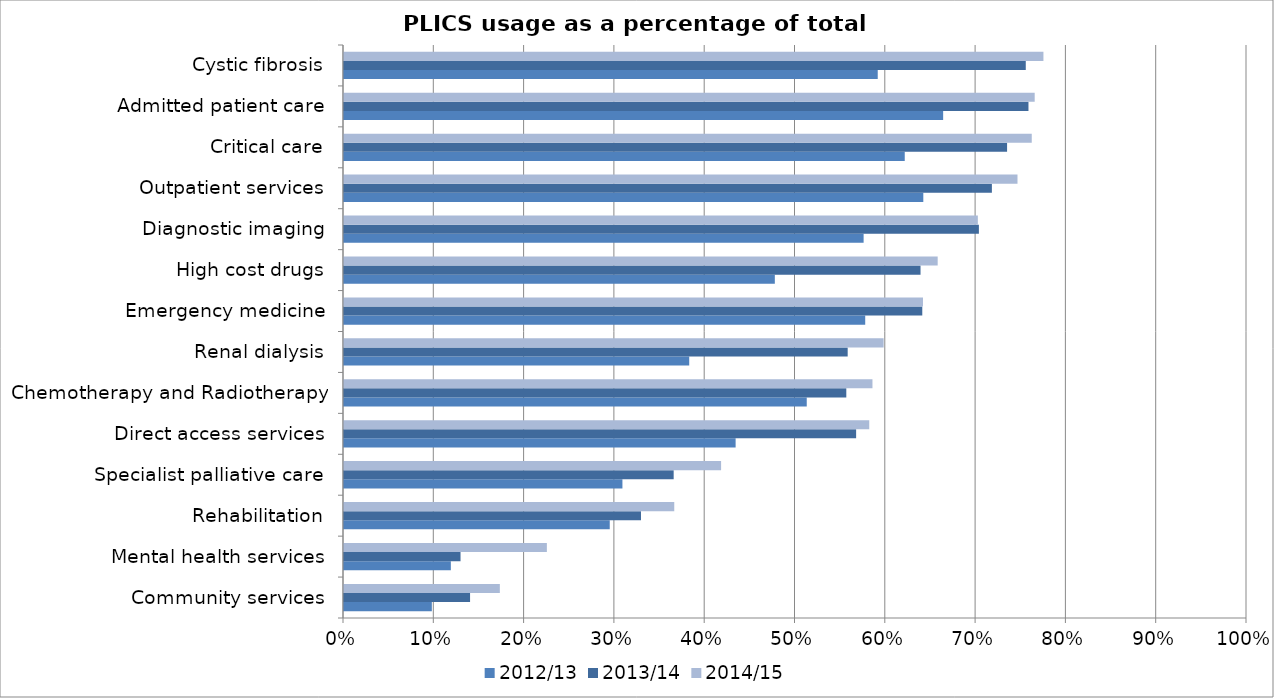
| Category | 2012/13 | 2013/14 | 2014/15 |
|---|---|---|---|
| Community services | 0.097 | 0.14 | 0.173 |
| Mental health services | 0.118 | 0.129 | 0.225 |
| Rehabilitation | 0.294 | 0.329 | 0.366 |
| Specialist palliative care | 0.308 | 0.365 | 0.418 |
| Direct access services | 0.434 | 0.567 | 0.582 |
| Chemotherapy and Radiotherapy | 0.512 | 0.556 | 0.585 |
| Renal dialysis | 0.382 | 0.558 | 0.598 |
| Emergency medicine | 0.577 | 0.64 | 0.641 |
| High cost drugs | 0.477 | 0.638 | 0.657 |
| Diagnostic imaging | 0.575 | 0.703 | 0.702 |
| Outpatient services | 0.642 | 0.717 | 0.746 |
| Critical care | 0.621 | 0.734 | 0.762 |
| Admitted patient care | 0.664 | 0.758 | 0.765 |
| Cystic fibrosis | 0.591 | 0.755 | 0.775 |